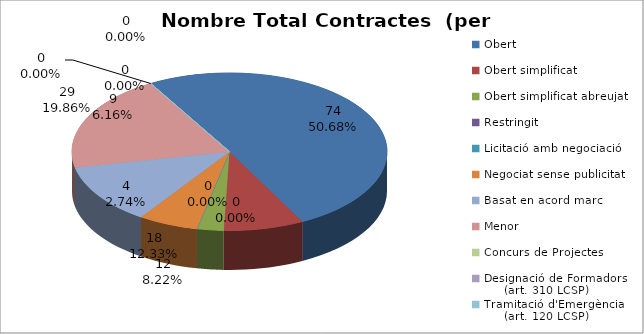
| Category | Nombre Total Contractes |
|---|---|
| Obert | 74 |
| Obert simplificat | 12 |
| Obert simplificat abreujat | 4 |
| Restringit | 0 |
| Licitació amb negociació | 0 |
| Negociat sense publicitat | 9 |
| Basat en acord marc | 18 |
| Menor | 29 |
| Concurs de Projectes | 0 |
| Designació de Formadors
     (art. 310 LCSP) | 0 |
| Tramitació d'Emergència
     (art. 120 LCSP) | 0 |